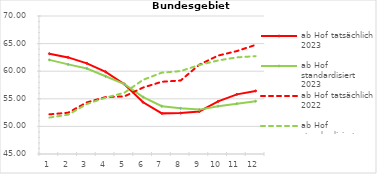
| Category | ab Hof tatsächlich 2023 | ab Hof standardisiert 2023 | ab Hof tatsächlich 2022 | ab Hof standardisiert 2022 |
|---|---|---|---|---|
| 0 | 63.177 | 62.053 | 52.183 | 51.603 |
| 1 | 62.499 | 61.232 | 52.48 | 52.123 |
| 2 | 61.421 | 60.487 | 54.35 | 54.055 |
| 3 | 59.889 | 59.084 | 55.313 | 55.201 |
| 4 | 57.647 | 57.658 | 55.433 | 56.104 |
| 5 | 54.367 | 55.321 | 57.041 | 58.436 |
| 6 | 52.36 | 53.662 | 58.089 | 59.743 |
| 7 | 52.415 | 53.271 | 58.313 | 60.017 |
| 8 | 52.705 | 53.04 | 61.186 | 61.126 |
| 9 | 54.522 | 53.669 | 62.829 | 61.952 |
| 10 | 55.803 | 54.116 | 63.645 | 62.503 |
| 11 | 56.426 | 54.564 | 64.771 | 62.726 |